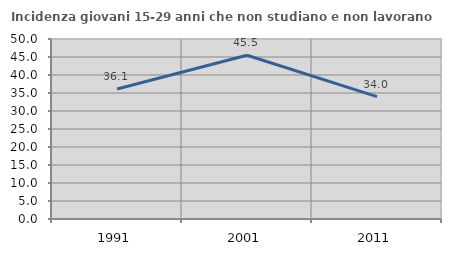
| Category | Incidenza giovani 15-29 anni che non studiano e non lavorano  |
|---|---|
| 1991.0 | 36.091 |
| 2001.0 | 45.498 |
| 2011.0 | 34.012 |